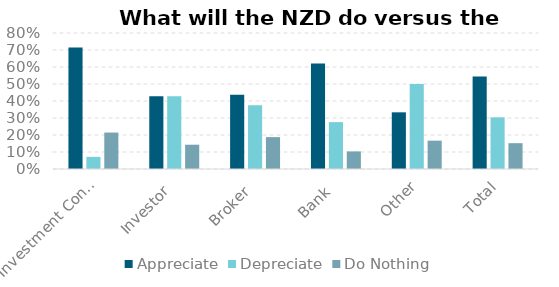
| Category | Appreciate | Depreciate | Do Nothing |
|---|---|---|---|
| Investment Consultant | 0.714 | 0.071 | 0.214 |
| Investor | 0.429 | 0.429 | 0.143 |
| Broker | 0.438 | 0.375 | 0.188 |
| Bank | 0.621 | 0.276 | 0.103 |
| Other | 0.333 | 0.5 | 0.167 |
| Total | 0.544 | 0.304 | 0.152 |